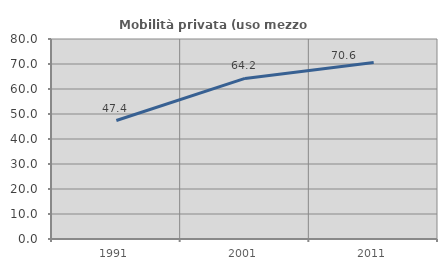
| Category | Mobilità privata (uso mezzo privato) |
|---|---|
| 1991.0 | 47.396 |
| 2001.0 | 64.221 |
| 2011.0 | 70.629 |